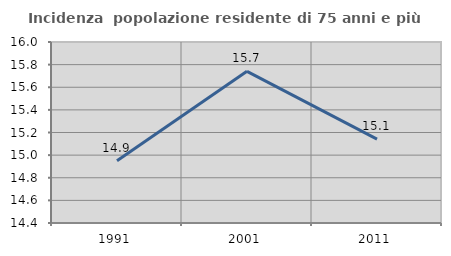
| Category | Incidenza  popolazione residente di 75 anni e più |
|---|---|
| 1991.0 | 14.95 |
| 2001.0 | 15.741 |
| 2011.0 | 15.141 |